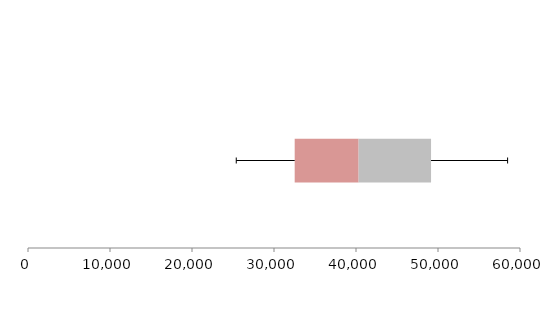
| Category | Series 1 | Series 2 | Series 3 |
|---|---|---|---|
| 0 | 32522.927 | 7797.478 | 8831.113 |